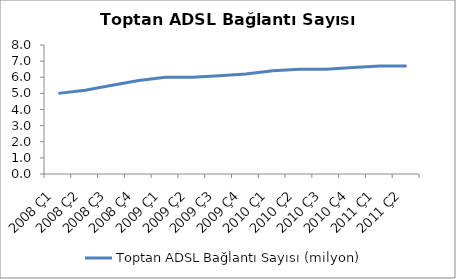
| Category | Toptan ADSL Bağlantı Sayısı (milyon) |
|---|---|
| 2008 Ç1 | 5 |
| 2008 Ç2 | 5.2 |
| 2008 Ç3 | 5.5 |
| 2008 Ç4 | 5.8 |
| 2009 Ç1 | 6 |
| 2009 Ç2 | 6 |
| 2009 Ç3 | 6.1 |
| 2009 Ç4 | 6.2 |
| 2010 Ç1 | 6.4 |
| 2010 Ç2 | 6.5 |
| 2010 Ç3 | 6.5 |
| 2010 Ç4 | 6.6 |
| 2011 Ç1 | 6.7 |
| 2011 Ç2 | 6.7 |